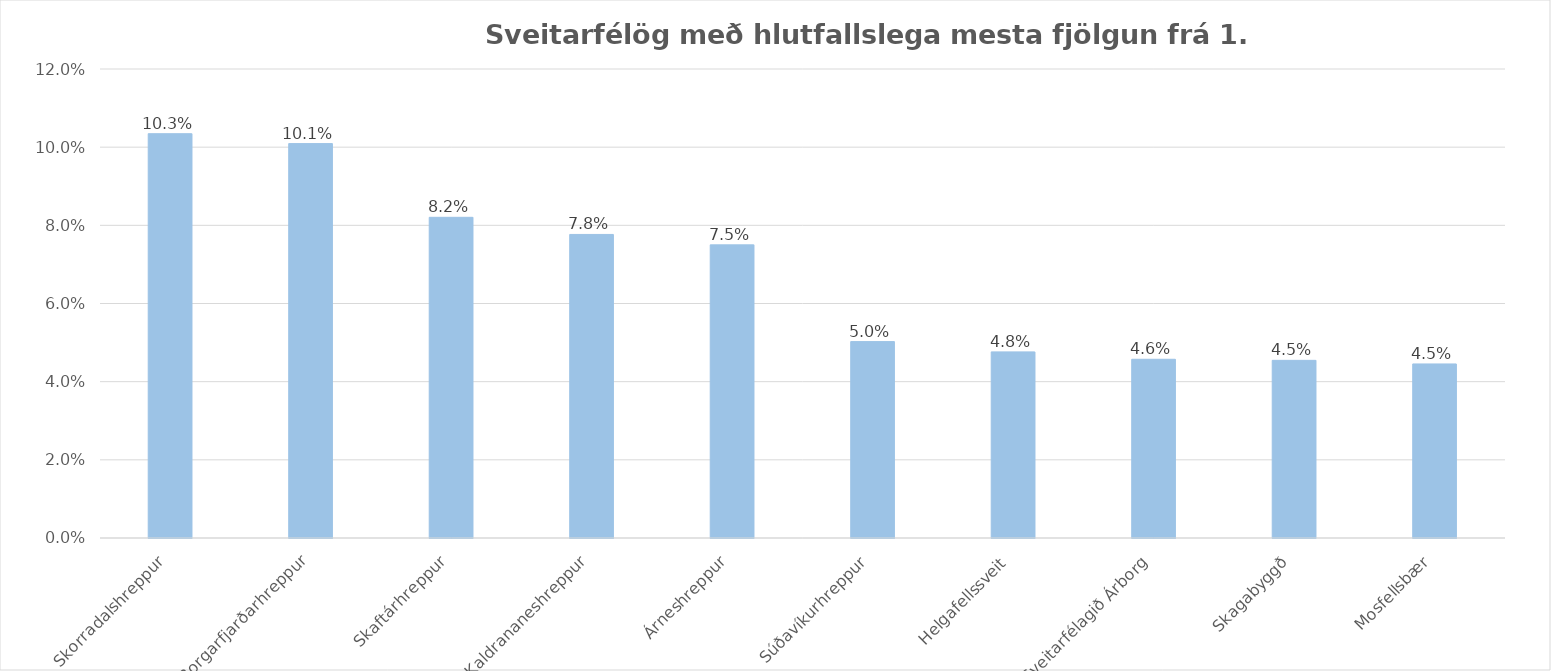
| Category | Breytingar |
|---|---|
| Skorradalshreppur | 0.103 |
| Borgarfjarðarhreppur | 0.101 |
| Skaftárhreppur | 0.082 |
| Kaldrananeshreppur | 0.078 |
| Árneshreppur | 0.075 |
| Súðavíkurhreppur | 0.05 |
| Helgafellssveit | 0.048 |
| Sveitarfélagið Árborg | 0.046 |
| Skagabyggð | 0.045 |
| Mosfellsbær | 0.045 |